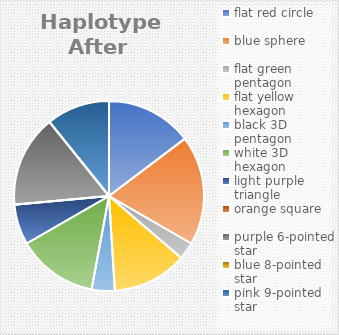
| Category | Series 8 | Series 9 | Series 10 | Series 11 | Series 12 | Series 13 | Series 14 | Series 15 | Series 4 | Series 5 | Series 6 | Series 7 | Series 2 | Series 3 | Series 1 | Series 0 |
|---|---|---|---|---|---|---|---|---|---|---|---|---|---|---|---|---|
| flat red circle | 15 | 26 | 15 | 26 | 15 | 26 | 15 | 26 | 15 | 26 | 15 | 26 | 15 | 26 | 15 | 26 |
| blue sphere | 19 | 24 | 19 | 24 | 19 | 24 | 19 | 24 | 19 | 24 | 19 | 24 | 19 | 24 | 19 | 24 |
| flat green pentagon | 3 | 13 | 3 | 13 | 3 | 13 | 3 | 13 | 3 | 13 | 3 | 13 | 3 | 13 | 3 | 13 |
| flat yellow hexagon | 13 | 13 | 13 | 13 | 13 | 13 | 13 | 13 | 13 | 13 | 13 | 13 | 13 | 13 | 13 | 13 |
| black 3D pentagon | 4 | 10 | 4 | 10 | 4 | 10 | 4 | 10 | 4 | 10 | 4 | 10 | 4 | 10 | 4 | 10 |
| white 3D hexagon | 14 | 14 | 14 | 14 | 14 | 14 | 14 | 14 | 14 | 14 | 14 | 14 | 14 | 14 | 14 | 14 |
| light purple triangle | 7 | 7 | 7 | 7 | 7 | 7 | 7 | 7 | 7 | 7 | 7 | 7 | 7 | 7 | 7 | 7 |
| orange square | 0 | 4 | 0 | 4 | 0 | 4 | 0 | 4 | 0 | 4 | 0 | 4 | 0 | 4 | 0 | 4 |
| purple 6-pointed star | 16 | 16 | 16 | 16 | 16 | 16 | 16 | 16 | 16 | 16 | 16 | 16 | 16 | 16 | 16 | 16 |
| blue 8-pointed star | 0 | 12 | 0 | 12 | 0 | 12 | 0 | 12 | 0 | 12 | 0 | 12 | 0 | 12 | 0 | 12 |
| pink 9-pointed star | 11 | 11 | 11 | 11 | 11 | 11 | 11 | 11 | 11 | 11 | 11 | 11 | 11 | 11 | 11 | 11 |